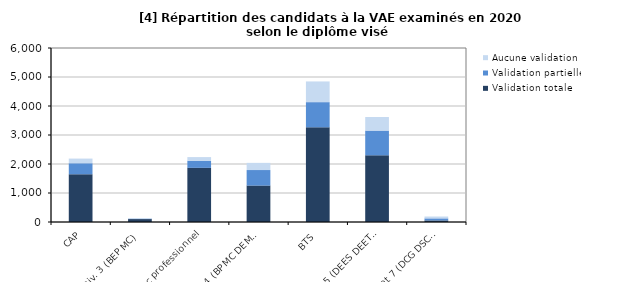
| Category | Validation totale | Validation partielle | Aucune validation |
|---|---|---|---|
| CAP | 1647 | 379 | 161 |
| Autre niv. 3 (BEP MC) | 101 | 12 | 16 |
| Bac professionnel | 1867 | 245 | 126 |
| Autre niv. 4 (BP MC DEME) | 1255 | 537 | 247 |
| BTS | 3265 | 868 | 714 |
| Autre niv. 5 (DEES DEETS) | 2299 | 853 | 468 |
| Niveaux 6 et 7 (DCG DSCG) | 55 | 70 | 64 |